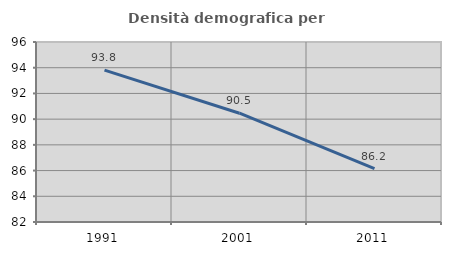
| Category | Densità demografica |
|---|---|
| 1991.0 | 93.814 |
| 2001.0 | 90.461 |
| 2011.0 | 86.155 |